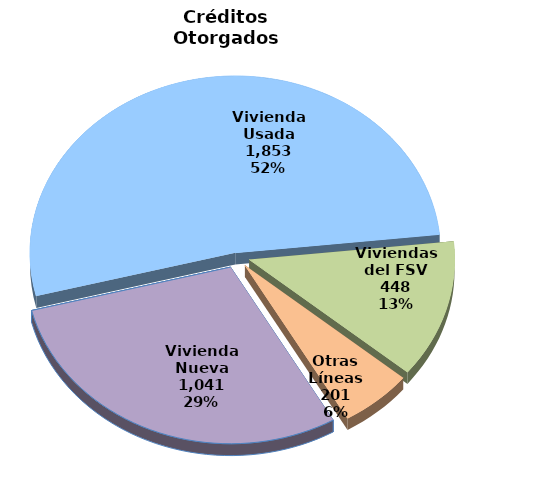
| Category | Series 0 |
|---|---|
| Vivienda Nueva | 1041 |
| Vivienda Usada | 1853 |
| Viviendas del FSV | 448 |
| Otras Líneas | 201 |